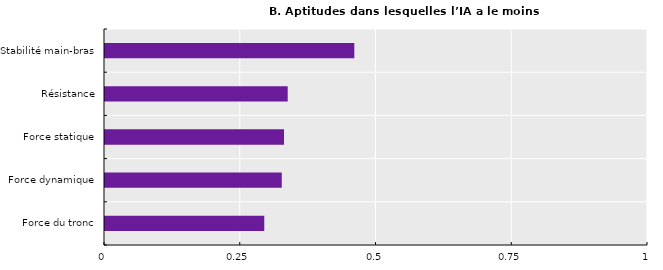
| Category | Series 0 |
|---|---|
| Force du tronc | 0.293 |
| Force dynamique | 0.326 |
| Force statique | 0.33 |
| Résistance | 0.336 |
| Stabilité main-bras | 0.459 |